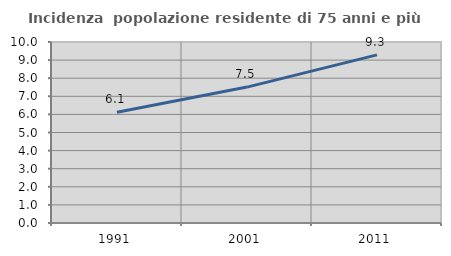
| Category | Incidenza  popolazione residente di 75 anni e più |
|---|---|
| 1991.0 | 6.124 |
| 2001.0 | 7.509 |
| 2011.0 | 9.286 |